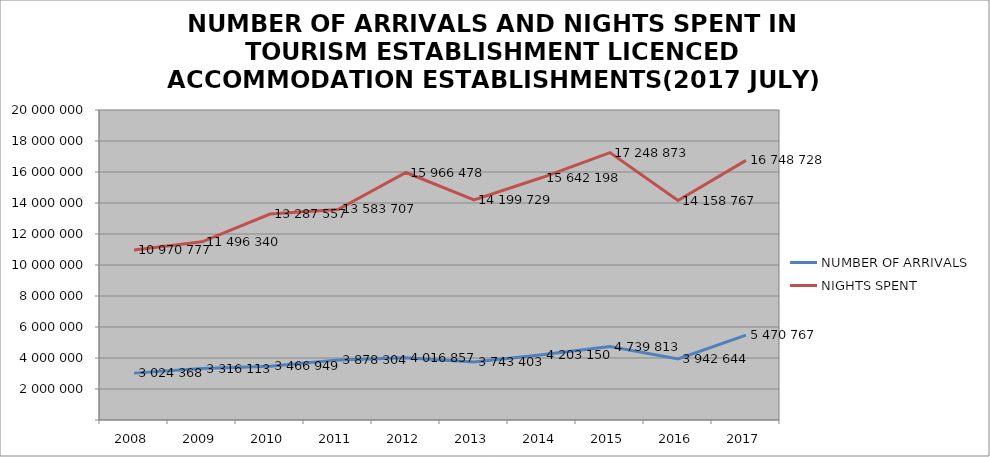
| Category | NUMBER OF ARRIVALS | NIGHTS SPENT |
|---|---|---|
| 2008 | 3024368 | 10970777 |
| 2009 | 3316113 | 11496340 |
| 2010 | 3466949 | 13287557 |
| 2011 | 3878304 | 13583707 |
| 2012 | 4016857 | 15966478 |
| 2013 | 3743403 | 14199729 |
| 2014 | 4203150 | 15642198 |
| 2015 | 4739813 | 17248873 |
| 2016 | 3942644 | 14158767 |
| 2017 | 5470767 | 16748728 |